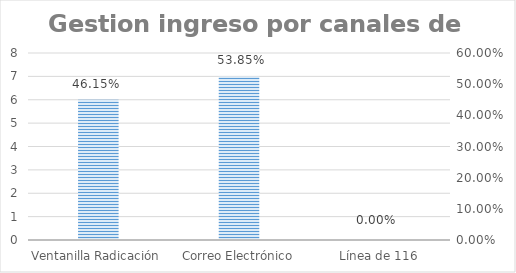
| Category | Series 0 |
|---|---|
| Ventanilla Radicación | 6 |
| Correo Electrónico | 7 |
| Línea de 116 | 0 |